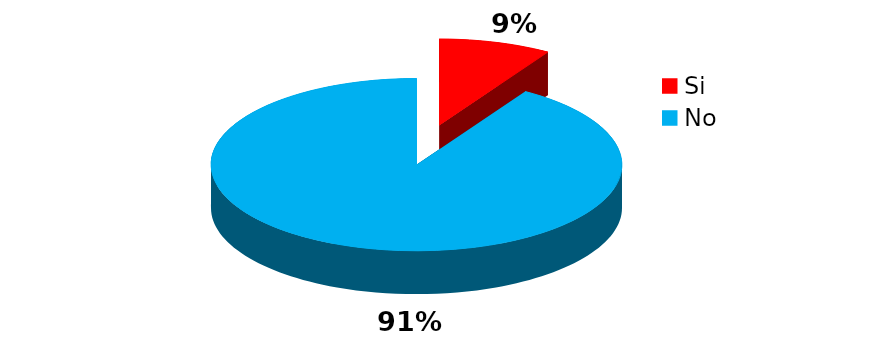
| Category | Series 0 |
|---|---|
| Si | 11 |
| No | 113 |